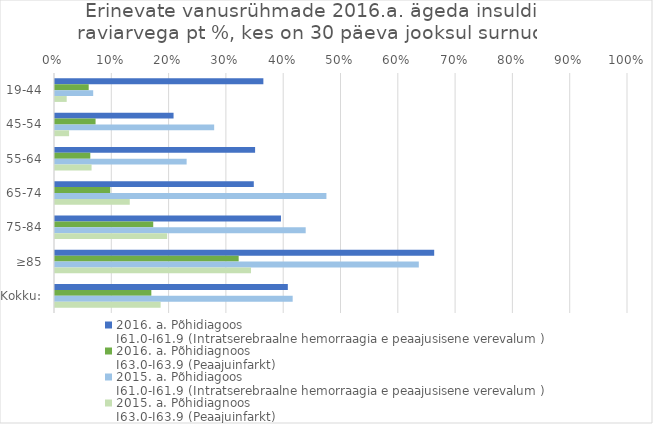
| Category | 2016. a. Põhidiagoos 
I61.0-I61.9 (Intratserebraalne hemorraagia e peaajusisene verevalum ) | 2016. a. Põhidiagnoos
I63.0-I63.9 (Peaajuinfarkt) | 2015. a. Põhidiagoos 
I61.0-I61.9 (Intratserebraalne hemorraagia e peaajusisene verevalum ) | 2015. a. Põhidiagnoos
I63.0-I63.9 (Peaajuinfarkt) |
|---|---|---|---|---|
| 19-44 | 0.364 | 0.059 | 0.067 | 0.02 |
| 45-54 | 0.207 | 0.071 | 0.278 | 0.025 |
| 55-64 | 0.349 | 0.062 | 0.23 | 0.064 |
| 65-74 | 0.347 | 0.096 | 0.474 | 0.13 |
| 75-84 | 0.394 | 0.171 | 0.438 | 0.196 |
| ≥85 | 0.662 | 0.321 | 0.635 | 0.342 |
| Kokku: | 0.406 | 0.168 | 0.415 | 0.184 |